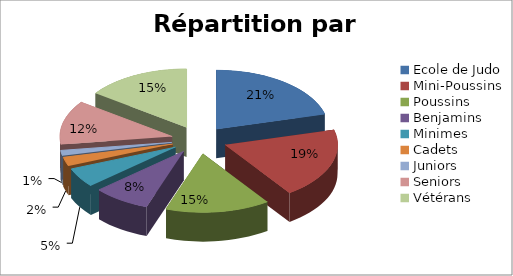
| Category | Series 0 |
|---|---|
| Ecole de Judo | 43 |
| Mini-Poussins | 40 |
| Poussins | 31 |
| Benjamins | 17 |
| Minimes | 11 |
| Cadets | 5 |
| Juniors | 3 |
| Seniors | 25 |
| Vétérans | 31 |